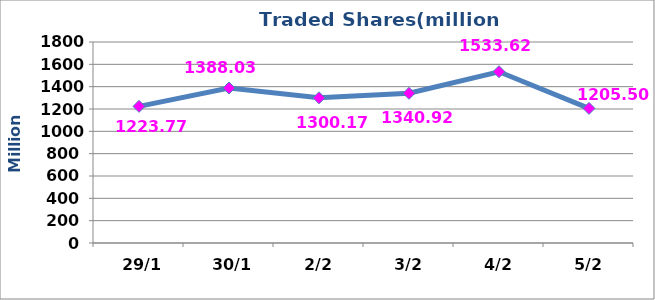
| Category | عدد الاسهم |
|---|---|
|  29/1 | 1223770279 |
|  30/1 | 1388037526 |
|  2/2 | 1300176559 |
|  3/2 | 1340919589 |
|  4/2 | 1533620937 |
|  5/2 | 1205505885 |